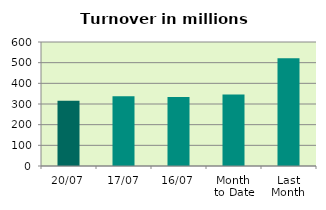
| Category | Series 0 |
|---|---|
| 20/07 | 315.539 |
| 17/07 | 336.935 |
| 16/07 | 333.556 |
| Month 
to Date | 345.758 |
| Last
Month | 521.023 |